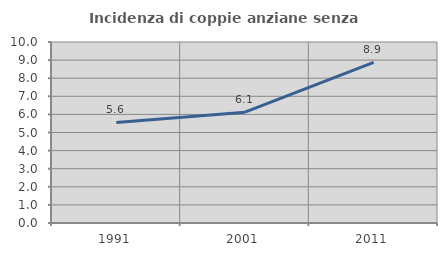
| Category | Incidenza di coppie anziane senza figli  |
|---|---|
| 1991.0 | 5.556 |
| 2001.0 | 6.122 |
| 2011.0 | 8.869 |